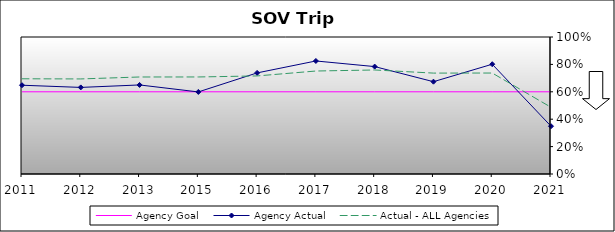
| Category | Agency Goal | Agency Actual | Actual - ALL Agencies |
|---|---|---|---|
| 2011.0 | 0.6 | 0.648 | 0.695 |
| 2012.0 | 0.6 | 0.632 | 0.694 |
| 2013.0 | 0.6 | 0.65 | 0.708 |
| 2015.0 | 0.6 | 0.599 | 0.708 |
| 2016.0 | 0.6 | 0.738 | 0.716 |
| 2017.0 | 0.6 | 0.825 | 0.752 |
| 2018.0 | 0.6 | 0.784 | 0.759 |
| 2019.0 | 0.6 | 0.674 | 0.736 |
| 2020.0 | 0.6 | 0.801 | 0.737 |
| 2021.0 | 0.6 | 0.349 | 0.487 |